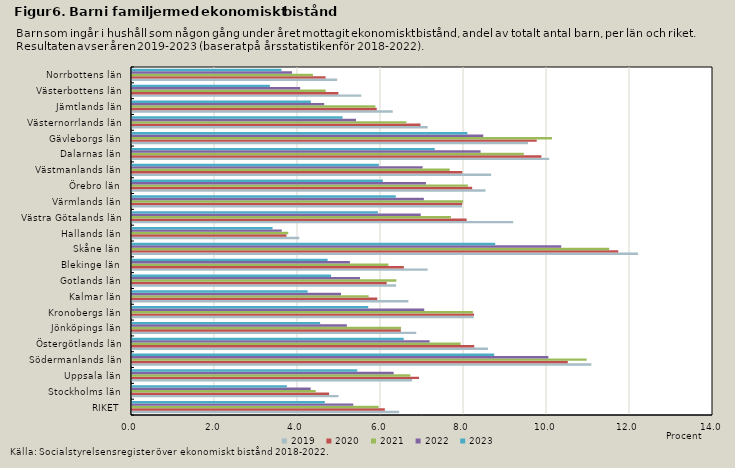
| Category | 2019 | 2020 | 2021 | 2022 | 2023 |
|---|---|---|---|---|---|
| RIKET | 6.439 | 6.092 | 5.941 | 5.333 | 4.646 |
| Stockholms län | 4.976 | 4.75 | 4.428 | 4.304 | 3.732 |
| Uppsala län | 6.751 | 6.917 | 6.707 | 6.306 | 5.428 |
| Södermanlands län | 11.068 | 10.501 | 10.955 | 10.033 | 8.727 |
| Östergötlands län | 8.576 | 8.247 | 7.92 | 7.172 | 6.547 |
| Jönköpings län | 6.849 | 6.478 | 6.483 | 5.177 | 4.533 |
| Kronobergs län | 8.234 | 8.242 | 8.214 | 7.041 | 5.693 |
| Kalmar län | 6.66 | 5.91 | 5.703 | 5.037 | 4.231 |
| Gotlands län | 6.363 | 6.137 | 6.371 | 5.495 | 4.798 |
| Blekinge län | 7.124 | 6.551 | 6.178 | 5.251 | 4.714 |
| Skåne län | 12.194 | 11.716 | 11.498 | 10.342 | 8.753 |
| Hallands län | 4.031 | 3.722 | 3.765 | 3.609 | 3.387 |
| Västra Götalands län | 9.185 | 8.064 | 7.686 | 6.957 | 5.926 |
| Värmlands län | 7.951 | 7.958 | 7.979 | 7.033 | 6.356 |
| Örebro län | 8.518 | 8.197 | 8.093 | 7.083 | 6.045 |
| Västmanlands län | 8.654 | 7.959 | 7.656 | 7.002 | 5.948 |
| Dalarnas län | 10.054 | 9.865 | 9.44 | 8.399 | 7.295 |
| Gävleborgs län | 9.541 | 9.753 | 10.119 | 8.463 | 8.081 |
| Västernorrlands län | 7.124 | 6.952 | 6.611 | 5.398 | 5.073 |
| Jämtlands län | 6.283 | 5.897 | 5.864 | 4.631 | 4.31 |
| Västerbottens län | 5.526 | 4.973 | 4.666 | 4.053 | 3.323 |
| Norrbottens län | 4.944 | 4.665 | 4.361 | 3.855 | 3.602 |